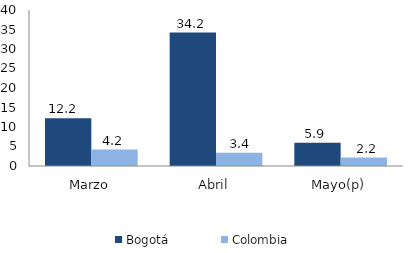
| Category | Bogotá | Colombia |
|---|---|---|
| Marzo | 12.215 | 4.199 |
| Abril | 34.215 | 3.378 |
| Mayo(p) | 5.937 | 2.151 |